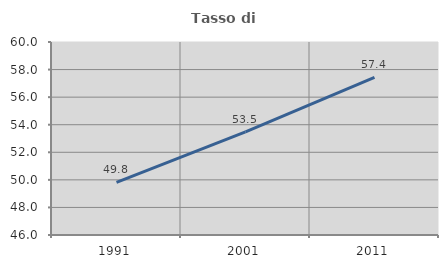
| Category | Tasso di occupazione   |
|---|---|
| 1991.0 | 49.822 |
| 2001.0 | 53.482 |
| 2011.0 | 57.433 |